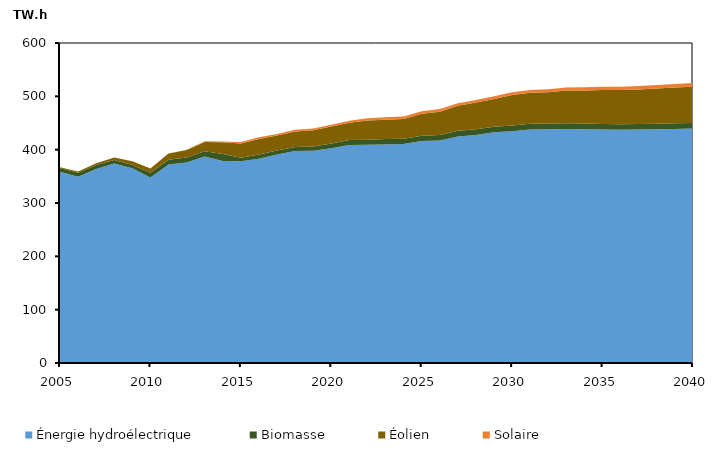
| Category | Énergie hydroélectrique | Biomasse | Éolien | Solaire |
|---|---|---|---|---|
| 2005.0 | 358.396 | 7.267 | 1.453 | 0 |
| 2006.0 | 349.14 | 7.413 | 2.529 | 0 |
| 2007.0 | 363.814 | 7.241 | 3.683 | 0 |
| 2008.0 | 373.832 | 6.613 | 4.715 | 0 |
| 2009.0 | 365.042 | 6.238 | 7.031 | 0.005 |
| 2010.0 | 347.965 | 8.563 | 8.354 | 0.123 |
| 2011.0 | 371.979 | 9.026 | 11.623 | 0.398 |
| 2012.0 | 375.787 | 9.392 | 13.997 | 0.842 |
| 2013.0 | 387.411 | 9.546 | 17.545 | 1.173 |
| 2014.0 | 378.802 | 12.961 | 22.01 | 1.758 |
| 2015.0 | 378.112 | 6.589 | 26.632 | 2.954 |
| 2016.0 | 383.055 | 8.081 | 28.825 | 3.238 |
| 2017.0 | 391.08 | 7.434 | 28.009 | 2.988 |
| 2018.0 | 397.325 | 7.787 | 29.146 | 3.197 |
| 2019.0 | 397.943 | 7.967 | 30.52 | 3.316 |
| 2020.0 | 402.637 | 8.905 | 31.856 | 3.388 |
| 2021.0 | 408.863 | 9.158 | 32.504 | 3.682 |
| 2022.0 | 409.183 | 9.326 | 36.151 | 4.44 |
| 2023.0 | 409.881 | 9.965 | 36.3 | 4.479 |
| 2024.0 | 410.489 | 10 | 36.957 | 4.59 |
| 2025.0 | 416.077 | 10.101 | 41.192 | 4.809 |
| 2026.0 | 417.105 | 10.272 | 43.848 | 4.912 |
| 2027.0 | 424.852 | 10.48 | 46.871 | 4.998 |
| 2028.0 | 427.356 | 10.936 | 49.945 | 5.099 |
| 2029.0 | 432.48 | 10.662 | 51.686 | 5.158 |
| 2030.0 | 434.571 | 10.63 | 57.191 | 5.306 |
| 2031.0 | 437.778 | 10.699 | 58.11 | 5.365 |
| 2032.0 | 438.18 | 10.702 | 58.796 | 5.495 |
| 2033.0 | 438.543 | 11.047 | 61.569 | 5.556 |
| 2034.0 | 438.336 | 10.559 | 62.253 | 5.714 |
| 2035.0 | 437.775 | 10.377 | 63.608 | 5.986 |
| 2036.0 | 437.174 | 10.385 | 64.33 | 6.226 |
| 2037.0 | 437.66 | 10.397 | 64.818 | 6.414 |
| 2038.0 | 438.155 | 10.407 | 66.113 | 6.514 |
| 2039.0 | 438.898 | 10.423 | 67.083 | 6.686 |
| 2040.0 | 439.515 | 10.43 | 68.042 | 6.899 |